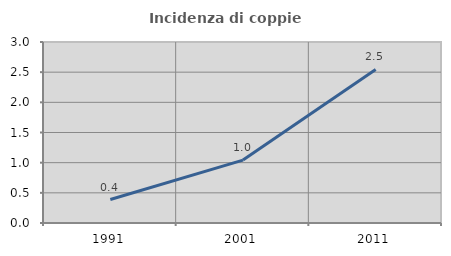
| Category | Incidenza di coppie miste |
|---|---|
| 1991.0 | 0.389 |
| 2001.0 | 1.043 |
| 2011.0 | 2.545 |